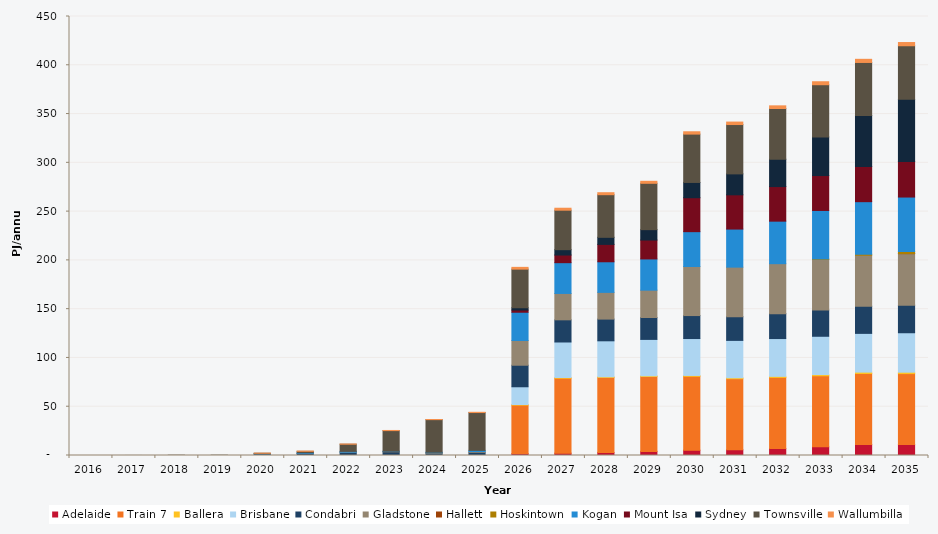
| Category | Adelaide | Train 7 | Ballera | Brisbane | Condabri | Gladstone | Hallett | Hoskintown | Kogan | Mount Isa | Sydney | Townsville | Wallumbilla |
|---|---|---|---|---|---|---|---|---|---|---|---|---|---|
| 2016.0 | 0 | 0 | 0 | 0 | 0 | 0 | 0 | 0 | 0 | 0 | 0 | 0 | 0 |
| 2017.0 | 0 | 0 | 0 | 0 | 0 | 0 | 0 | 0 | 0 | 0 | 0 | 0.033 | 0 |
| 2018.0 | 0 | 0 | 0 | 0 | 0 | 0 | 0 | 0 | 0 | 0 | 0 | 0.29 | 0 |
| 2019.0 | 0 | 0 | 0 | 0 | 0 | 0 | 0 | 0 | 0 | 0 | 0 | 0.301 | 0 |
| 2020.0 | 0 | 0 | 0 | 0 | 1.56 | 0 | 0 | 0 | 0.247 | 0 | 0 | 0.523 | 0.102 |
| 2021.0 | 0 | 0 | 0 | 0 | 2.12 | 0.001 | 0 | 0 | 0.709 | 0 | 0 | 1.453 | 0.212 |
| 2022.0 | 0 | 0 | 0 | 0 | 3.296 | 0.129 | 0 | 0 | 0.784 | 0 | 0 | 7.349 | 0.205 |
| 2023.0 | 0 | 0 | 0 | 0 | 3.781 | 0.384 | 0 | 0 | 0.265 | 0 | 0 | 21.083 | 0.151 |
| 2024.0 | 0 | 0 | 0 | 0 | 2.383 | 0.524 | 0 | 0 | 0.451 | 0 | 0 | 33.396 | 0.154 |
| 2025.0 | 0 | 0 | 0 | 0 | 3.242 | 0.815 | 0 | 0 | 1.206 | 0 | 0 | 38.763 | 0.26 |
| 2026.0 | 1.907 | 49.779 | 0.583 | 18.186 | 22.082 | 25.322 | 0 | 0 | 28.99 | 2.223 | 2.38 | 39.587 | 1.815 |
| 2027.0 | 2.427 | 76.794 | 0.702 | 36.431 | 22.715 | 27.035 | 0 | 0 | 31.554 | 7.834 | 5.488 | 40.461 | 2.03 |
| 2028.0 | 3.139 | 76.874 | 0.679 | 36.875 | 22.259 | 27.385 | 0 | 0 | 31.368 | 17.818 | 7.249 | 43.692 | 2.037 |
| 2029.0 | 4.225 | 76.765 | 0.713 | 37.306 | 22.448 | 28.008 | 0 | 0 | 32.026 | 19.356 | 10.666 | 47.503 | 2.061 |
| 2030.0 | 5.418 | 75.781 | 0.843 | 37.853 | 23.556 | 50.259 | 0 | 0 | 35.731 | 34.782 | 15.676 | 49.55 | 2.397 |
| 2031.0 | 5.841 | 72.889 | 0.963 | 38.299 | 24.339 | 50.756 | 0 | 0 | 39.019 | 35.102 | 21.464 | 50.582 | 2.53 |
| 2032.0 | 7.068 | 72.959 | 1.098 | 38.75 | 25.528 | 51.234 | 0 | 0 | 43.571 | 35.437 | 28.005 | 52.035 | 2.729 |
| 2033.0 | 8.86 | 72.86 | 1.27 | 39.225 | 26.94 | 51.748 | 0 | 0.577 | 49.689 | 35.784 | 39.545 | 53.576 | 3.045 |
| 2034.0 | 11.237 | 72.846 | 1.383 | 39.713 | 27.852 | 52.268 | 0 | 1.028 | 53.854 | 36.132 | 52.187 | 54.384 | 3.228 |
| 2035.0 | 11.235 | 72.726 | 1.436 | 40.436 | 28.287 | 52.804 | 0.025 | 2.223 | 55.764 | 36.483 | 63.882 | 54.715 | 3.304 |